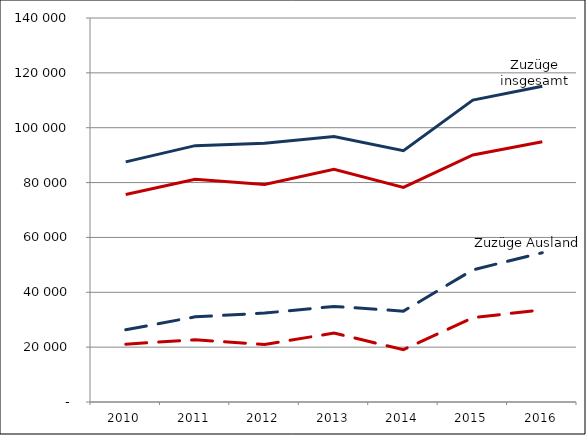
| Category | Zuzüge insgesamt | Zuzüge Ausland | Fortzüge insgesamt | Fortzüge Ausland |
|---|---|---|---|---|
| 2010.0 | 87538 | 26324 | 75668 | 21078 |
| 2011.0 | 93466 | 31048 | 81231 | 22674 |
| 2012.0 | 94346 | 32412 | 79335 | 20979 |
| 2013.0 | 96782 | 34839 | 84823 | 25125 |
| 2014.0 | 91594 | 33131 | 78218 | 19091 |
| 2015.0 | 110070 | 48173 | 90072 | 30757 |
| 2016.0 | 115115 | 54438 | 94914 | 33587 |